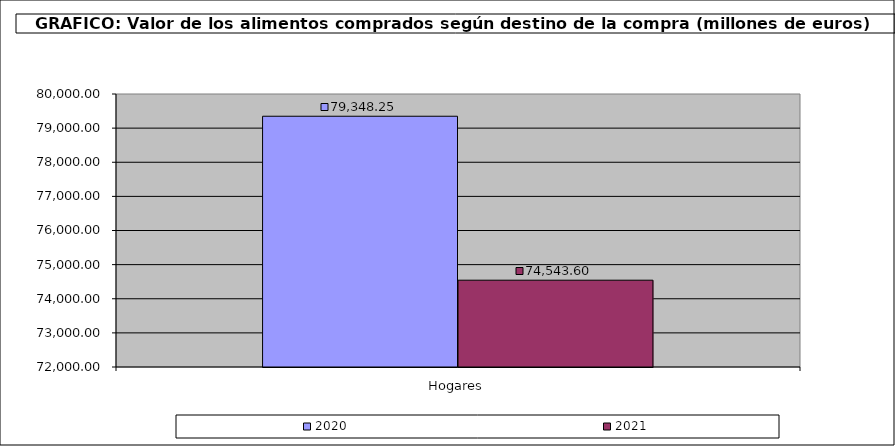
| Category | 2020 | 2021 |
|---|---|---|
| 0 | 79348.254 | 74543.604 |